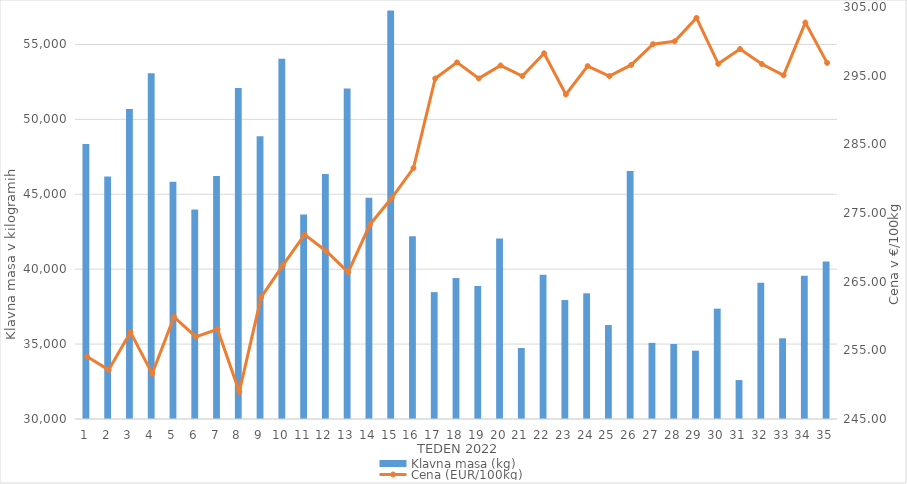
| Category | Klavna masa (kg) |
|---|---|
| 1.0 | 48349 |
| 2.0 | 46187 |
| 3.0 | 50692 |
| 4.0 | 53081 |
| 5.0 | 45844 |
| 6.0 | 43982 |
| 7.0 | 46227 |
| 8.0 | 52099 |
| 9.0 | 48872 |
| 10.0 | 54045 |
| 11.0 | 43645 |
| 12.0 | 46350 |
| 13.0 | 52061 |
| 14.0 | 44774 |
| 15.0 | 57268 |
| 16.0 | 42191 |
| 17.0 | 38469 |
| 18.0 | 39417 |
| 19.0 | 38876 |
| 20.0 | 42047 |
| 21.0 | 34739 |
| 22.0 | 39626 |
| 23.0 | 37939 |
| 24.0 | 38390 |
| 25.0 | 36272 |
| 26.0 | 46553 |
| 27.0 | 35085 |
| 28.0 | 35007 |
| 29.0 | 34559 |
| 30.0 | 37366 |
| 31.0 | 32599 |
| 32.0 | 39100 |
| 33.0 | 35388 |
| 34.0 | 39563 |
| 35.0 | 40507 |